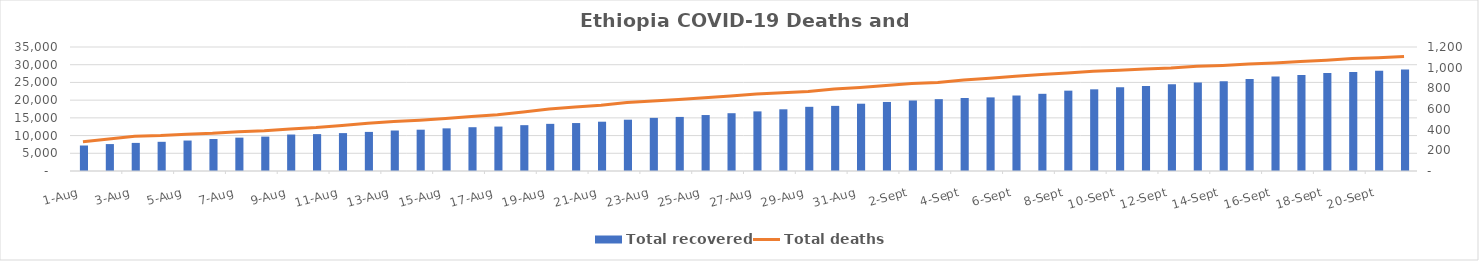
| Category | Total recovered  |
|---|---|
| 2020-09-21 | 28634 |
| 2020-09-20 | 28314 |
| 2020-09-19 | 27939 |
| 2020-09-18 | 27638 |
| 2020-09-17 | 27085 |
| 2020-09-16 | 26665 |
| 2020-09-15 | 25988 |
| 2020-09-14 | 25333 |
| 2020-09-13 | 24983 |
| 2020-09-12 | 24493 |
| 2020-09-11 | 24024 |
| 2020-09-10 | 23640 |
| 2020-09-09 | 23054 |
| 2020-09-08 | 22677 |
| 2020-09-07 | 21789 |
| 2020-09-06 | 21307 |
| 2020-09-05 | 20776 |
| 2020-09-04 | 20612 |
| 2020-09-03 | 20283 |
| 2020-09-02 | 19903 |
| 2020-09-01 | 19487 |
| 2020-08-31 | 18994 |
| 2020-08-30 | 18382 |
| 2020-08-29 | 18116 |
| 2020-08-28 | 17415 |
| 2020-08-27 | 16829 |
| 2020-08-26 | 16311 |
| 2020-08-25 | 15796 |
| 2020-08-24 | 15262 |
| 2020-08-23 | 14995 |
| 2020-08-22 | 14480 |
| 2020-08-21 | 13913 |
| 2020-08-20 | 13536 |
| 2020-08-19 | 13308 |
| 2020-08-18 | 12938 |
| 2020-08-17 | 12542 |
| 2020-08-16 | 12359 |
| 2020-08-15 | 12037 |
| 2020-08-14 | 11660 |
| 2020-08-13 | 11428 |
| 2020-08-12 | 11034 |
| 2020-08-11 | 10696 |
| 2020-08-10 | 10411 |
| 2020-08-09 | 10296 |
| 2020-08-08 | 9707 |
| 2020-08-07 | 9415 |
| 2020-08-06 | 9027 |
| 2020-08-05 | 8598 |
| 2020-08-04 | 8240 |
| 2020-08-03 | 7931 |
| 2020-08-02 | 7601 |
| 2020-08-01 | 7195 |